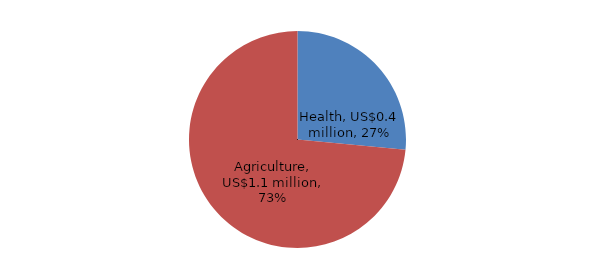
| Category | Series 0 |
|---|---|
| Health | 0.401 |
| Agriculture | 1.111 |